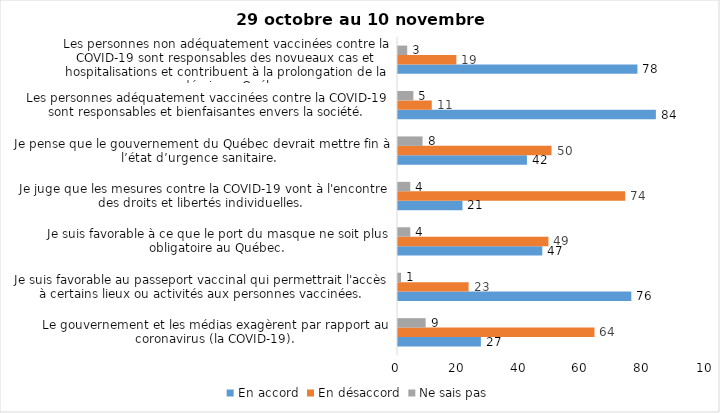
| Category | En accord | En désaccord | Ne sais pas |
|---|---|---|---|
| Le gouvernement et les médias exagèrent par rapport au coronavirus (la COVID-19). | 27 | 64 | 9 |
| Je suis favorable au passeport vaccinal qui permettrait l'accès à certains lieux ou activités aux personnes vaccinées. | 76 | 23 | 1 |
| Je suis favorable à ce que le port du masque ne soit plus obligatoire au Québec. | 47 | 49 | 4 |
| Je juge que les mesures contre la COVID-19 vont à l'encontre des droits et libertés individuelles.  | 21 | 74 | 4 |
| Je pense que le gouvernement du Québec devrait mettre fin à l’état d’urgence sanitaire.  | 42 | 50 | 8 |
| Les personnes adéquatement vaccinées contre la COVID-19 sont responsables et bienfaisantes envers la société. | 84 | 11 | 5 |
| Les personnes non adéquatement vaccinées contre la COVID-19 sont responsables des novueaux cas et hospitalisations et contribuent à la prolongation de la pandémie au Québec. | 78 | 19 | 3 |